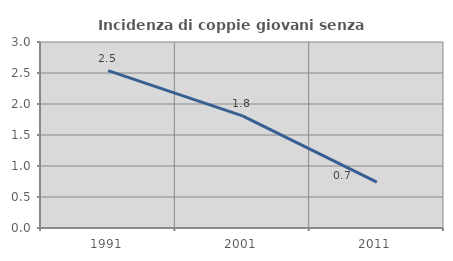
| Category | Incidenza di coppie giovani senza figli |
|---|---|
| 1991.0 | 2.538 |
| 2001.0 | 1.807 |
| 2011.0 | 0.741 |